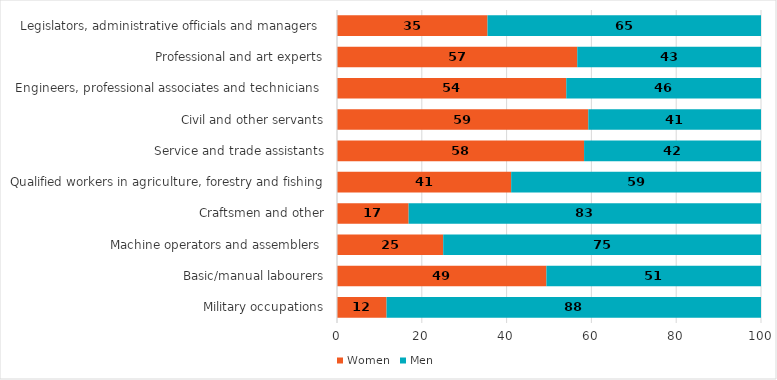
| Category | Women | Men |
|---|---|---|
| Military occupations | 11.688 | 88.312 |
| Basic/manual labourers | 49.392 | 50.608 |
| Machine operators and assemblers  | 25.049 | 74.951 |
| Craftsmen and other | 16.896 | 83.104 |
| Qualified workers in agriculture, forestry and fishing | 41.075 | 58.925 |
| Service and trade assistants | 58.274 | 41.726 |
| Civil and other servants | 59.271 | 40.729 |
| Engineers, professional associates and technicians  | 54.078 | 45.922 |
| Professional and art experts | 56.667 | 43.333 |
| Legislators, administrative officials and managers  | 35.498 | 64.502 |